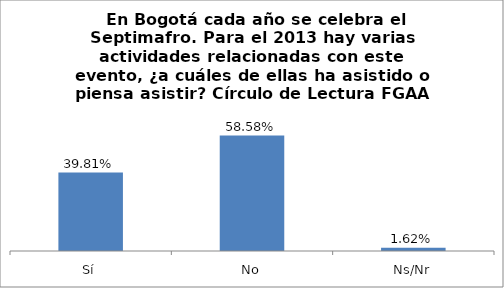
| Category | Total |
|---|---|
| Sí | 0.398 |
| No | 0.586 |
| Ns/Nr | 0.016 |